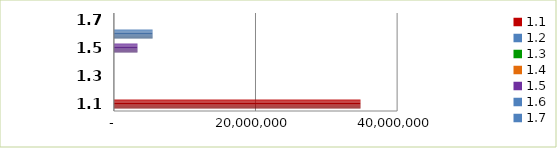
| Category | Series 0 |
|---|---|
| 1.1 | 34826508 |
| 1.2 | 0 |
| 1.3 | 0 |
| 1.4 | 0 |
| 1.5 | 3328800 |
| 1.6 | 5460183 |
| 1.7 | 0 |